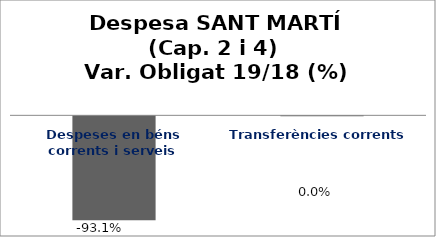
| Category | Series 0 |
|---|---|
| Despeses en béns corrents i serveis | -0.931 |
| Transferències corrents | 0 |